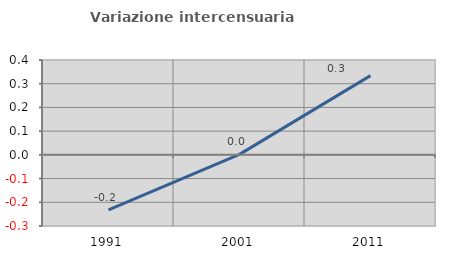
| Category | Variazione intercensuaria annua |
|---|---|
| 1991.0 | -0.232 |
| 2001.0 | 0.002 |
| 2011.0 | 0.334 |